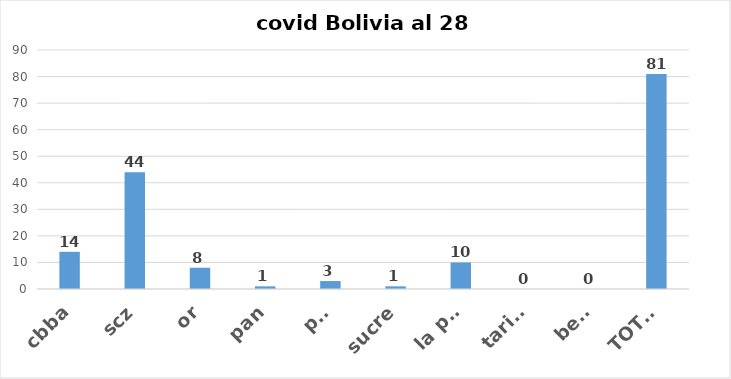
| Category | Series 0 |
|---|---|
| cbba | 14 |
| scz | 44 |
| or | 8 |
| pan | 1 |
| pot | 3 |
| sucre | 1 |
| la paz | 10 |
| tarija | 0 |
| beni | 0 |
| TOTAL | 81 |